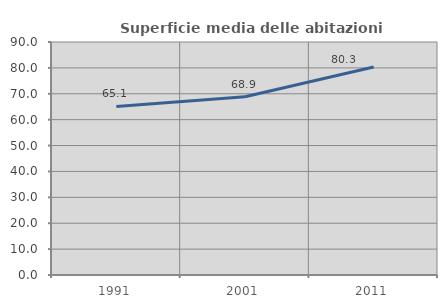
| Category | Superficie media delle abitazioni occupate |
|---|---|
| 1991.0 | 65.118 |
| 2001.0 | 68.866 |
| 2011.0 | 80.327 |